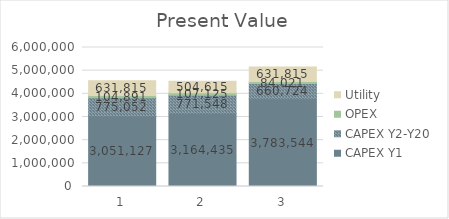
| Category | CAPEX Y1 | CAPEX Y2-Y20 | OPEX | Utility |
|---|---|---|---|---|
| 1.0 | 3051126.98 | 775051.725 | 104891.083 | 631814.624 |
| 2.0 | 3164434.98 | 771547.89 | 107124.751 | 504615.281 |
| 3.0 | 3783544.18 | 660723.564 | 84021.274 | 631814.624 |